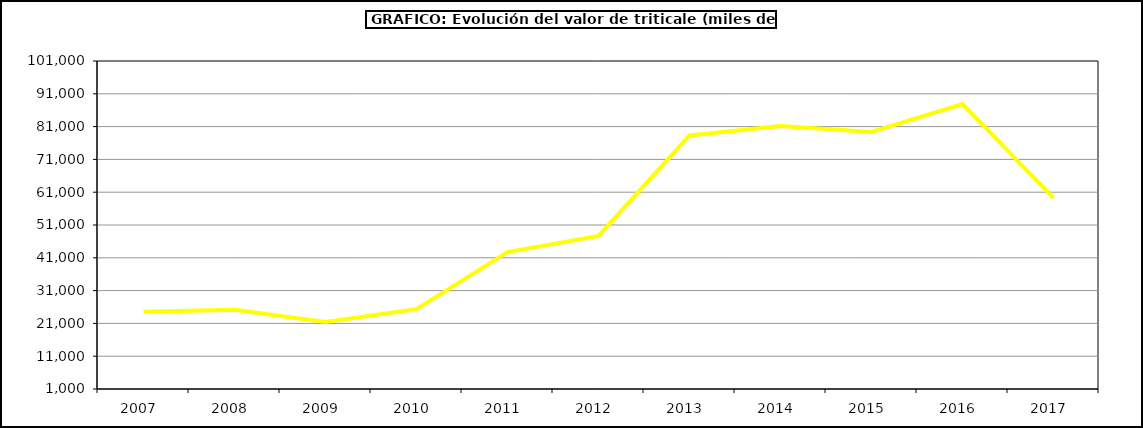
| Category | Producción |
|---|---|
| 2007.0 | 24583.25 |
| 2008.0 | 25178.261 |
| 2009.0 | 21396.86 |
| 2010.0 | 25344.427 |
| 2011.0 | 42728.352 |
| 2012.0 | 47678.033 |
| 2013.0 | 78279.322 |
| 2014.0 | 81166 |
| 2015.0 | 79377 |
| 2016.0 | 87859 |
| 2017.0 | 59282.944 |